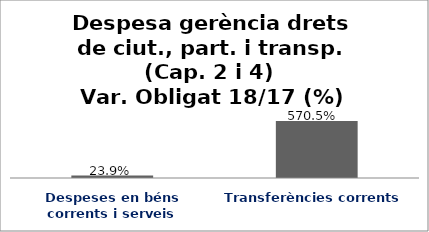
| Category | Series 0 |
|---|---|
| Despeses en béns corrents i serveis | 0.239 |
| Transferències corrents | 5.705 |